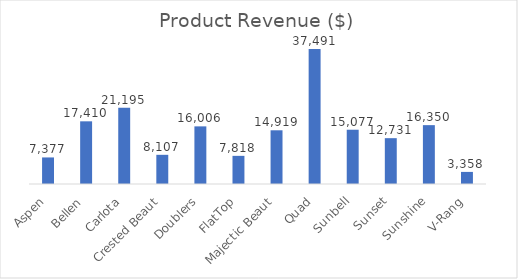
| Category | Total |
|---|---|
| Aspen | 7377.44 |
| Bellen | 17410.48 |
| Carlota | 21195.4 |
| Crested Beaut | 8107.09 |
| Doublers | 16005.6 |
| FlatTop | 7817.89 |
| Majectic Beaut | 14919.12 |
| Quad | 37490.83 |
| Sunbell | 15076.85 |
| Sunset | 12730.84 |
| Sunshine | 16349.76 |
| V-Rang | 3357.85 |